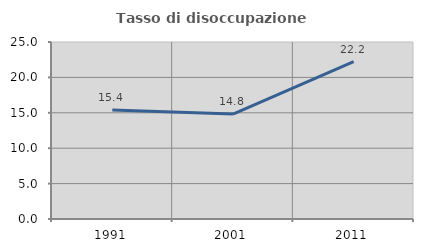
| Category | Tasso di disoccupazione giovanile  |
|---|---|
| 1991.0 | 15.385 |
| 2001.0 | 14.815 |
| 2011.0 | 22.222 |